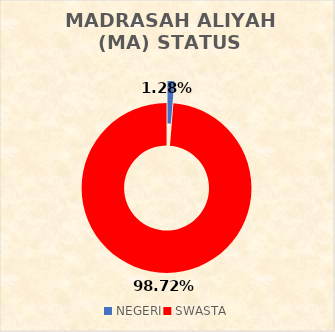
| Category | MADRASAH ALIYAH (MA) STATUS SEKOLAH |
|---|---|
| NEGERI | 1 |
| SWASTA | 77 |